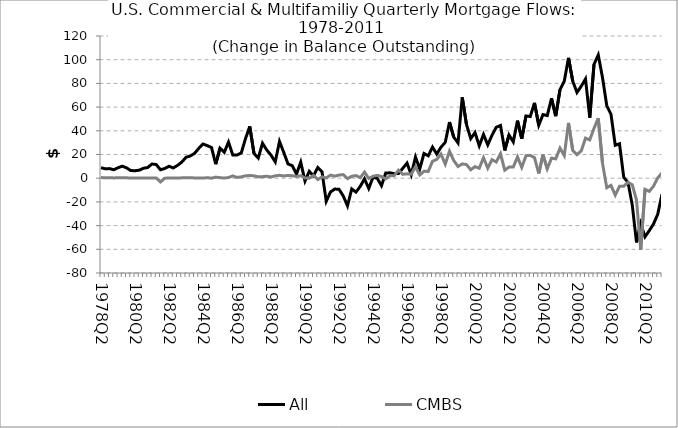
| Category | All | CMBS |
|---|---|---|
| 1978Q2 | 8.83 | 0.584 |
| 1978Q3 | 7.942 | 0.267 |
| 1978Q4 | 8.106 | 0.361 |
| 1979Q1 | 7.147 | 0.256 |
| 1979Q2 | 8.804 | 0.333 |
| 1979Q3 | 10.135 | 0.288 |
| 1979Q4 | 8.747 | 0.344 |
| 1980Q1 | 6.443 | 0.079 |
| 1980Q2 | 6.333 | 0.221 |
| 1980Q3 | 6.754 | 0.214 |
| 1980Q4 | 8.403 | 0.144 |
| 1981Q1 | 9.03 | 0.135 |
| 1981Q2 | 11.989 | 0.09 |
| 1981Q3 | 11.513 | 0.173 |
| 1981Q4 | 7.1 | -3.146 |
| 1982Q1 | 8.198 | 0.039 |
| 1982Q2 | 10.082 | 0.108 |
| 1982Q3 | 8.654 | 0.105 |
| 1982Q4 | 10.797 | 0.109 |
| 1983Q1 | 13.558 | 0.293 |
| 1983Q2 | 17.626 | 0.273 |
| 1983Q3 | 18.783 | 0.451 |
| 1983Q4 | 20.894 | 0.214 |
| 1984Q1 | 25.159 | 0.133 |
| 1984Q2 | 28.833 | 0.121 |
| 1984Q3 | 27.508 | 0.427 |
| 1984Q4 | 25.89 | 0.017 |
| 1985Q1 | 11.823 | 0.903 |
| 1985Q2 | 25.377 | 0.432 |
| 1985Q3 | 21.847 | 0.156 |
| 1985Q4 | 30.486 | 0.553 |
| 1986Q1 | 19.629 | 1.977 |
| 1986Q2 | 19.48 | 0.648 |
| 1986Q3 | 21.284 | 1.114 |
| 1986Q4 | 33.394 | 1.977 |
| 1987Q1 | 43.735 | 2.328 |
| 1987Q2 | 20.811 | 1.962 |
| 1987Q3 | 17.009 | 1.226 |
| 1987Q4 | 29.5 | 1.301 |
| 1988Q1 | 23.787 | 1.644 |
| 1988Q2 | 19.514 | 1.078 |
| 1988Q3 | 13.77 | 1.984 |
| 1988Q4 | 30.982 | 2.434 |
| 1989Q1 | 21.74 | 1.889 |
| 1989Q2 | 12.035 | 2.337 |
| 1989Q3 | 10.54 | 2.083 |
| 1989Q4 | 3.501 | 1.494 |
| 1990Q1 | 13.528 | 2.101 |
| 1990Q2 | -2.435 | 0.222 |
| 1990Q3 | 5.788 | 0 |
| 1990Q4 | 2.026 | 2.407 |
| 1991Q1 | 8.991 | -1.178 |
| 1991Q2 | 5.467 | 1.139 |
| 1991Q3 | -19.52 | 0.16 |
| 1991Q4 | -11.625 | 2.599 |
| 1992Q1 | -9.17 | 1.715 |
| 1992Q2 | -9.337 | 2.651 |
| 1992Q3 | -15.013 | 2.998 |
| 1992Q4 | -23.332 | -0.353 |
| 1993Q1 | -9.048 | 1.644 |
| 1993Q2 | -11.727 | 2.189 |
| 1993Q3 | -6.885 | 0.415 |
| 1993Q4 | -0.547 | 5.152 |
| 1994Q1 | -8.656 | -0.204 |
| 1994Q2 | 0.812 | 1.61 |
| 1994Q3 | -0.096 | 2.404 |
| 1994Q4 | -6.37 | 1.394 |
| 1995Q1 | 4.417 | -0.551 |
| 1995Q2 | 4.538 | 2.175 |
| 1995Q3 | 3.809 | 2.13 |
| 1995Q4 | 3.936 | 6.785 |
| 1996Q1 | 8.294 | 3.326 |
| 1996Q2 | 12.764 | 3.674 |
| 1996Q3 | 2.949 | 3.399 |
| 1996Q4 | 17.864 | 9.699 |
| 1997Q1 | 7.786 | 2.748 |
| 1997Q2 | 20.866 | 5.893 |
| 1997Q3 | 18.893 | 5.702 |
| 1997Q4 | 26.227 | 14.278 |
| 1998Q1 | 20.412 | 15.853 |
| 1998Q2 | 26.172 | 20.333 |
| 1998Q3 | 30.298 | 11.848 |
| 1998Q4 | 47.391 | 22.781 |
| 1999Q1 | 34.599 | 14.89 |
| 1999Q2 | 29.773 | 9.864 |
| 1999Q3 | 68.195 | 12.062 |
| 1999Q4 | 45.192 | 11.477 |
| 2000Q1 | 33.413 | 7.108 |
| 2000Q2 | 38.531 | 9.733 |
| 2000Q3 | 27.316 | 8.415 |
| 2000Q4 | 36.933 | 17.286 |
| 2001Q1 | 28.122 | 8.484 |
| 2001Q2 | 36.265 | 15.64 |
| 2001Q3 | 42.988 | 13.698 |
| 2001Q4 | 44.48 | 20.667 |
| 2002Q1 | 23.46 | 6.787 |
| 2002Q2 | 36.48 | 9.356 |
| 2002Q3 | 30.633 | 9.433 |
| 2002Q4 | 48.588 | 17.94 |
| 2003Q1 | 33.255 | 9.108 |
| 2003Q2 | 52.536 | 18.981 |
| 2003Q3 | 52.038 | 19.278 |
| 2003Q4 | 63.582 | 17.395 |
| 2004Q1 | 44.732 | 3.969 |
| 2004Q2 | 53.683 | 19.853 |
| 2004Q3 | 52.87 | 7.877 |
| 2004Q4 | 67.393 | 16.912 |
| 2005Q1 | 52.374 | 16.305 |
| 2005Q2 | 74.738 | 25.369 |
| 2005Q3 | 81.878 | 19.114 |
| 2005Q4 | 101.542 | 46.658 |
| 2006Q1 | 81.813 | 23.409 |
| 2006Q2 | 72.343 | 19.844 |
| 2006Q3 | 77.682 | 23.098 |
| 2006Q4 | 83.742 | 33.827 |
| 2007Q1 | 51.092 | 32.311 |
| 2007Q2 | 96.133 | 42.077 |
| 2007Q3 | 104.005 | 50.645 |
| 2007Q4 | 85.002 | 12.685 |
| 2008Q1 | 61.297 | -7.96 |
| 2008Q2 | 53.879 | -6.009 |
| 2008Q3 | 27.868 | -14.289 |
| 2008Q4 | 29.013 | -6.781 |
| 2009Q1 | 0.668 | -6.762 |
| 2009Q2 | -3.481 | -3.47 |
| 2009Q3 | -22.529 | -5.498 |
| 2009Q4 | -54.169 | -18.512 |
| 2010Q1 | -38.275 | -60.388 |
| 2010Q2 | -49.438 | -9.368 |
| 2010Q3 | -44.277 | -11.089 |
| 2010Q4 | -38.602 | -6.682 |
| 2011Q1 | -30.381 | 0.28 |
| 2011Q2 | -13.489 | 4.438 |